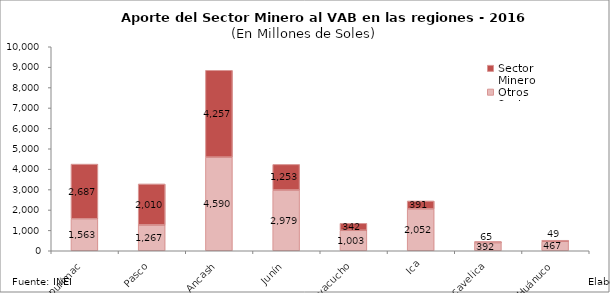
| Category | Otros Sectores | Sector Minero |
|---|---|---|
| Apurímac | 1563.216 | 2686.544 |
| Pasco | 1267.475 | 2010.288 |
| Ancash | 4589.845 | 4256.724 |
| Junín | 2979.404 | 1253.29 |
| Ayacucho | 1003.078 | 342.085 |
| Ica | 2051.799 | 391.279 |
| Huancavelica | 391.829 | 64.666 |
| Huánuco | 466.9 | 49.078 |